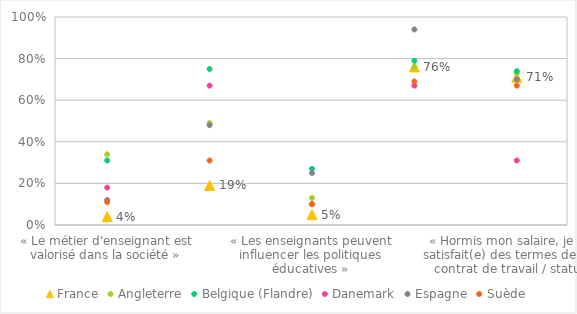
| Category | France | Angleterre | Belgique (Flandre) | Danemark | Espagne | Suède |
|---|---|---|---|---|---|---|
| « Le métier d'enseignant est valorisé dans la société » | 0.04 | 0.34 | 0.31 | 0.18 | 0.12 | 0.11 |
| « Je suis satisfait(e) de mon salaire » | 0.19 | 0.49 | 0.75 | 0.67 | 0.48 | 0.31 |
| « Les enseignants peuvent influencer les politiques éducatives » | 0.05 | 0.13 | 0.27 | 0.1 | 0.25 | 0.1 |
| «  Si c'était à refaire, je choisirais à nouveau le métier d'enseignant » | 0.76 | 0.76 | 0.79 | 0.67 | 0.94 | 0.69 |
| « Hormis mon salaire, je suis satisfait(e) des termes de mon contrat de travail / statut » | 0.71 | 0.73 | 0.74 | 0.31 | 0.7 | 0.67 |